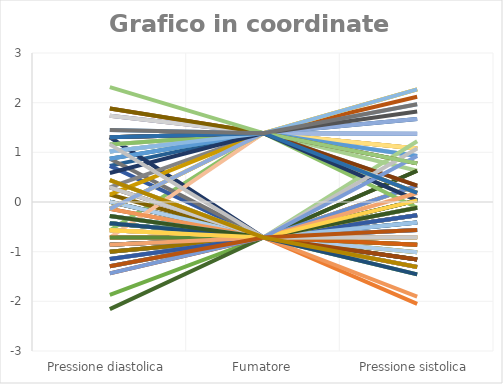
| Category | Series 0 | Series 1 | Series 2 | Series 3 | Series 4 | Series 5 | Series 6 | Series 7 | Series 8 | Series 9 | Series 10 | Series 11 | Series 12 | Series 13 | Series 14 | Series 15 | Series 16 | Series 17 | Series 18 | Series 19 | Series 20 | Series 21 | Series 22 | Series 23 | Series 24 | Series 25 | Series 26 | Series 27 | Series 28 | Series 29 | Series 30 | Series 31 | Series 32 | Series 33 | Series 34 | Series 35 | Series 36 | Series 37 | Series 38 | Series 39 | Series 40 | Series 41 | Series 42 | Series 43 | Series 44 | Series 45 | Series 46 | Series 47 | Series 48 | Series 49 | Series 50 | Series 51 | Series 52 | Series 53 | Series 54 | Series 55 | Series 56 | Series 57 | Series 58 | Series 59 | Series 60 | Series 61 | Series 62 | Series 63 | Series 64 | Series 65 | Series 66 | Series 67 | Series 68 | Series 69 | Series 70 | Series 71 | Series 72 | Series 73 | Series 74 | Series 75 | Series 76 | Series 77 | Series 78 | Series 79 | Series 80 | Series 81 | Series 82 | Series 83 | Series 84 | Series 85 | Series 86 | Series 87 | Series 88 | Series 89 | Series 90 | Series 91 | Series 92 | Series 93 | Series 94 | Series 95 | Series 96 | Series 97 | Series 98 | Series 99 |
|---|---|---|---|---|---|---|---|---|---|---|---|---|---|---|---|---|---|---|---|---|---|---|---|---|---|---|---|---|---|---|---|---|---|---|---|---|---|---|---|---|---|---|---|---|---|---|---|---|---|---|---|---|---|---|---|---|---|---|---|---|---|---|---|---|---|---|---|---|---|---|---|---|---|---|---|---|---|---|---|---|---|---|---|---|---|---|---|---|---|---|---|---|---|---|---|---|---|---|---|---|
| Pressione diastolica | 1.448 | -0.86 | 0.006 | -1.148 | -0.427 | -1.869 | 0.727 | -0.138 | -0.715 | 0.439 | -0.86 | -2.158 | -1.292 | 1.737 | -0.571 | 1.304 | 1.737 | -0.571 | -0.86 | -1.004 | -1.148 | -0.571 | 0.727 | 1.016 | 1.881 | -0.86 | -0.427 | -1.004 | 0.006 | 0.871 | 1.304 | 0.006 | -0.427 | 0.15 | 1.304 | 0.006 | 1.016 | 0.294 | 1.016 | -1.292 | 1.304 | -0.427 | 0.871 | 1.881 | 0.871 | -0.86 | -0.283 | -1.004 | 0.006 | -0.715 | 1.737 | 1.16 | 1.16 | 0.439 | 0.871 | -0.571 | -1.292 | -0.138 | -1.004 | -0.283 | -0.86 | -1.437 | 0.294 | -1.004 | -0.427 | -0.427 | -0.571 | -0.138 | -0.571 | -0.138 | -1.148 | 1.16 | -1.292 | -0.715 | 0.294 | 0.15 | -1.148 | -0.715 | -0.283 | -0.571 | 0.294 | -0.571 | -0.138 | -0.427 | -0.427 | 1.304 | 1.304 | 1.881 | 0.583 | -0.283 | 1.016 | -0.86 | 1.16 | -0.571 | -1.437 | 2.314 | 1.304 | -1.292 | 1.448 | 0.439 |
| Fumatore | 1.386 | -0.714 | -0.714 | -0.714 | -0.714 | -0.714 | 1.386 | -0.714 | -0.714 | -0.714 | -0.714 | -0.714 | -0.714 | 1.386 | -0.714 | 1.386 | 1.386 | 1.386 | -0.714 | -0.714 | -0.714 | -0.714 | -0.714 | 1.386 | 1.386 | -0.714 | -0.714 | -0.714 | -0.714 | 1.386 | 1.386 | -0.714 | -0.714 | -0.714 | -0.714 | -0.714 | 1.386 | -0.714 | 1.386 | -0.714 | 1.386 | -0.714 | 1.386 | 1.386 | -0.714 | -0.714 | -0.714 | -0.714 | -0.714 | 1.386 | 1.386 | 1.386 | 1.386 | -0.714 | 1.386 | -0.714 | -0.714 | 1.386 | -0.714 | -0.714 | -0.714 | -0.714 | -0.714 | -0.714 | -0.714 | -0.714 | -0.714 | -0.714 | -0.714 | 1.386 | -0.714 | 1.386 | -0.714 | -0.714 | 1.386 | 1.386 | -0.714 | -0.714 | -0.714 | -0.714 | -0.714 | -0.714 | 1.386 | -0.714 | -0.714 | 1.386 | 1.386 | 1.386 | 1.386 | -0.714 | 1.386 | -0.714 | -0.714 | -0.714 | -0.714 | 1.386 | 1.386 | -0.714 | 1.386 | -0.714 |
| Pressione sistolica | 0.182 | -2.053 | 0.331 | -0.861 | -0.116 | -0.265 | 1.076 | -1.159 | -1.159 | -0.712 | -1.308 | -1.159 | 0.629 | 1.076 | -1.308 | 1.076 | 0.182 | 0.033 | -0.563 | 0.331 | -0.265 | 0.033 | -1.308 | 0.778 | 0.927 | -1.308 | -1.457 | 0.331 | -0.414 | 0.629 | 1.671 | -0.265 | -1.159 | 0.629 | -0.265 | 0.629 | 1.969 | -0.861 | 0.182 | -0.414 | 0.778 | -1.01 | 1.373 | 2.118 | -0.861 | -1.01 | -0.563 | 0.033 | -1.01 | 0.182 | 0.927 | 1.076 | 1.373 | -0.861 | 0.927 | -0.712 | -0.414 | 2.267 | -0.861 | -1.457 | -0.116 | -1.159 | -0.414 | -0.861 | 0.033 | 0.033 | -0.563 | -1.904 | -0.265 | 2.267 | 0.331 | -0.116 | -0.414 | -0.861 | 0.331 | 0.182 | -0.265 | -0.712 | -0.414 | -0.712 | -0.712 | -0.116 | 1.671 | 1.225 | -1.457 | 0.331 | 1.82 | 0.778 | 0.033 | -0.116 | 2.267 | 0.182 | 1.076 | 0.033 | 0.927 | 0.778 | 0.182 | -0.563 | 1.969 | -1.308 |